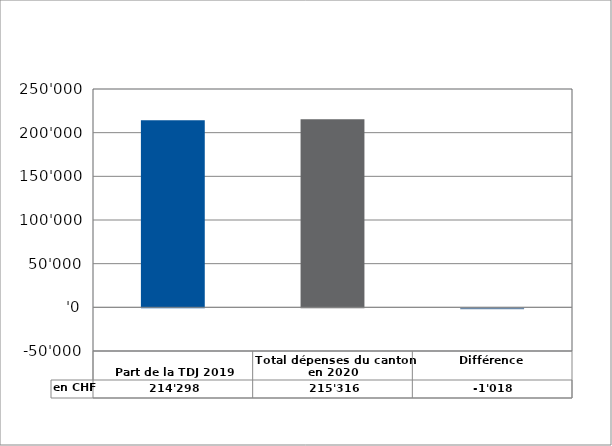
| Category | en CHF |
|---|---|
| 
Part de la TDJ 2019

 | 214298 |
| Total dépenses du canton en 2020 | 215315.77 |
| Différence | -1017.77 |